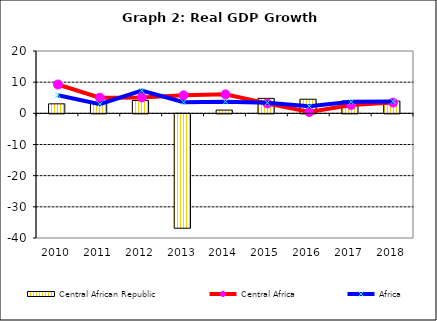
| Category | Central African Republic |
|---|---|
| 2010.0 | 3.047 |
| 2011.0 | 3.301 |
| 2012.0 | 4.113 |
| 2013.0 | -36.7 |
| 2014.0 | 1.04 |
| 2015.0 | 4.8 |
| 2016.0 | 4.531 |
| 2017.0 | 3.977 |
| 2018.0 | 3.93 |